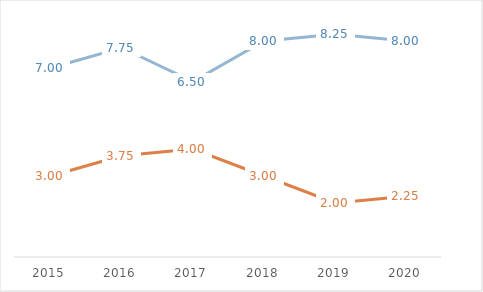
| Category | North | South |
|---|---|---|
| 2015.0 | 3 | 7 |
| 2016.0 | 3.75 | 7.75 |
| 2017.0 | 4 | 6.5 |
| 2018.0 | 3 | 8 |
| 2019.0 | 2 | 8.25 |
| 2020.0 | 2.25 | 8 |